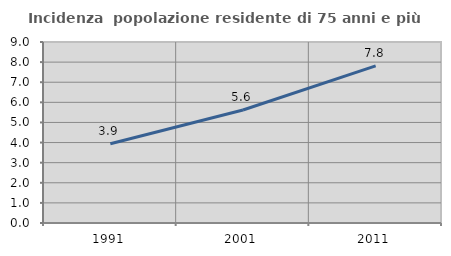
| Category | Incidenza  popolazione residente di 75 anni e più |
|---|---|
| 1991.0 | 3.942 |
| 2001.0 | 5.621 |
| 2011.0 | 7.811 |